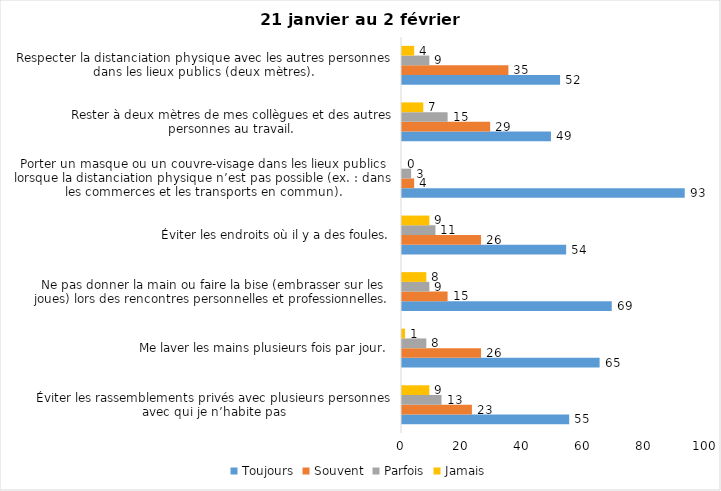
| Category | Toujours | Souvent | Parfois | Jamais |
|---|---|---|---|---|
| Éviter les rassemblements privés avec plusieurs personnes avec qui je n’habite pas | 55 | 23 | 13 | 9 |
| Me laver les mains plusieurs fois par jour. | 65 | 26 | 8 | 1 |
| Ne pas donner la main ou faire la bise (embrasser sur les joues) lors des rencontres personnelles et professionnelles. | 69 | 15 | 9 | 8 |
| Éviter les endroits où il y a des foules. | 54 | 26 | 11 | 9 |
| Porter un masque ou un couvre-visage dans les lieux publics lorsque la distanciation physique n’est pas possible (ex. : dans les commerces et les transports en commun). | 93 | 4 | 3 | 0 |
| Rester à deux mètres de mes collègues et des autres personnes au travail. | 49 | 29 | 15 | 7 |
| Respecter la distanciation physique avec les autres personnes dans les lieux publics (deux mètres). | 52 | 35 | 9 | 4 |